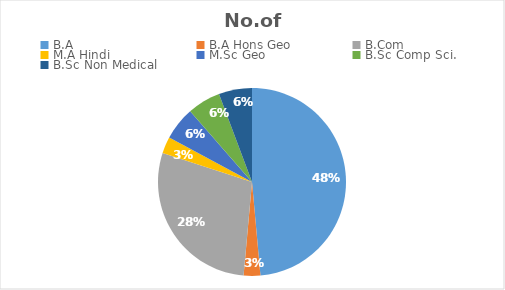
| Category | No.of students |
|---|---|
| B.A | 17 |
| B.A Hons Geo | 1 |
| B.Com | 10 |
| M.A Hindi | 1 |
| M.Sc Geo | 2 |
| B.Sc Comp Sci. | 2 |
| B.Sc Non Medical | 2 |